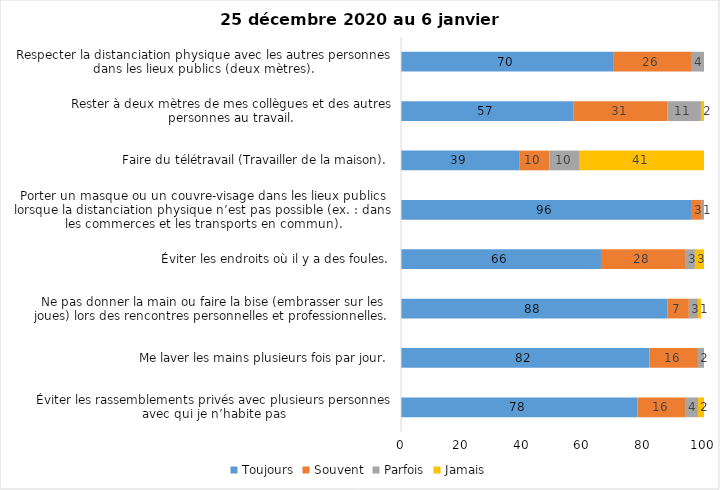
| Category | Toujours | Souvent | Parfois | Jamais |
|---|---|---|---|---|
| Éviter les rassemblements privés avec plusieurs personnes avec qui je n’habite pas | 78 | 16 | 4 | 2 |
| Me laver les mains plusieurs fois par jour. | 82 | 16 | 2 | 0 |
| Ne pas donner la main ou faire la bise (embrasser sur les joues) lors des rencontres personnelles et professionnelles. | 88 | 7 | 3 | 1 |
| Éviter les endroits où il y a des foules. | 66 | 28 | 3 | 3 |
| Porter un masque ou un couvre-visage dans les lieux publics lorsque la distanciation physique n’est pas possible (ex. : dans les commerces et les transports en commun). | 96 | 3 | 1 | 0 |
| Faire du télétravail (Travailler de la maison). | 39 | 10 | 10 | 41 |
| Rester à deux mètres de mes collègues et des autres personnes au travail. | 57 | 31 | 11 | 2 |
| Respecter la distanciation physique avec les autres personnes dans les lieux publics (deux mètres). | 70 | 26 | 4 | 0 |